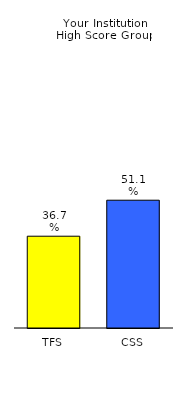
| Category | Series 0 |
|---|---|
| TFS | 0.367 |
| CSS | 0.511 |